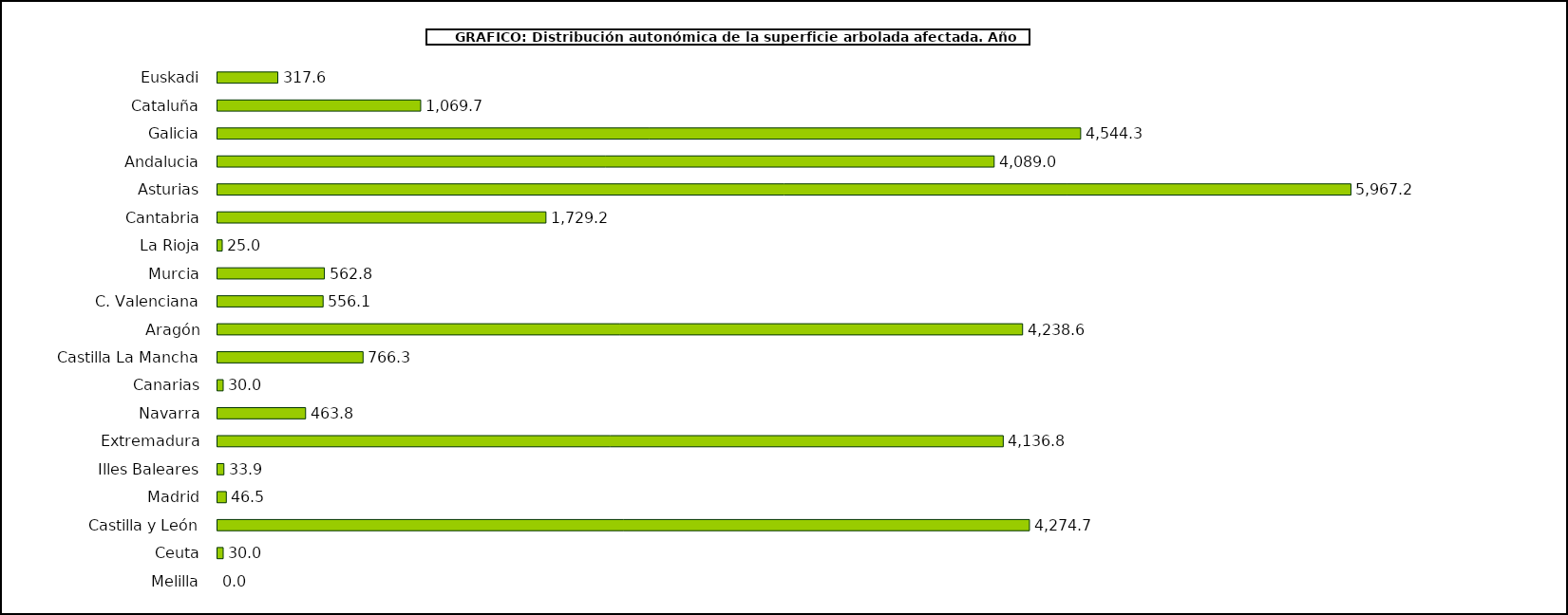
| Category | Superficie Arbolada afectada |
|---|---|
| Euskadi | 317.55 |
| Cataluña | 1069.74 |
| Galicia | 4544.25 |
| Andalucia | 4088.96 |
| Asturias | 5967.22 |
| Cantabria | 1729.24 |
| La Rioja | 24.98 |
| Murcia | 562.84 |
| C. Valenciana | 556.07 |
| Aragón | 4238.62 |
| Castilla La Mancha | 766.33 |
| Canarias | 29.97 |
| Navarra | 463.75 |
| Extremadura | 4136.78 |
| Illes Baleares | 33.9 |
| Madrid | 46.47 |
| Castilla y León | 4274.69 |
| Ceuta | 30 |
| Melilla | 0 |